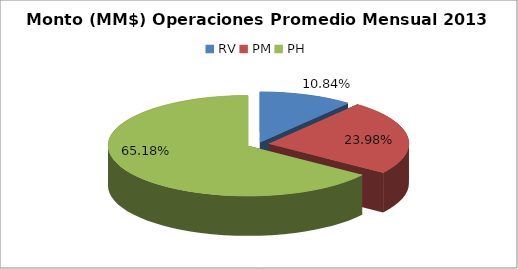
| Category | Series 0 |
|---|---|
| RV | 1346505.834 |
| PM | 2977172.337 |
| PH | 8093324.297 |